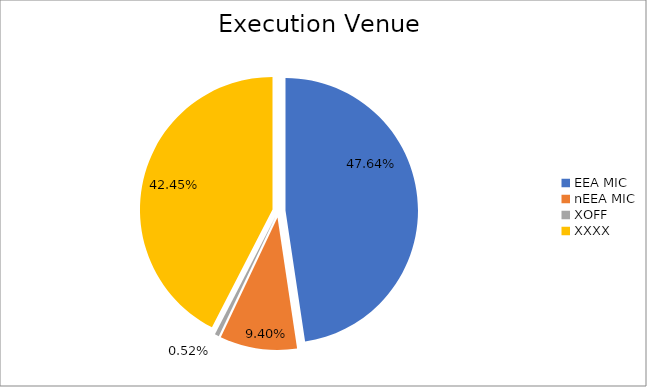
| Category | Series 0 |
|---|---|
| EEA MIC | 6381848.268 |
| nEEA MIC | 1259501.602 |
| XOFF | 69038.545 |
| XXXX | 5686259.161 |